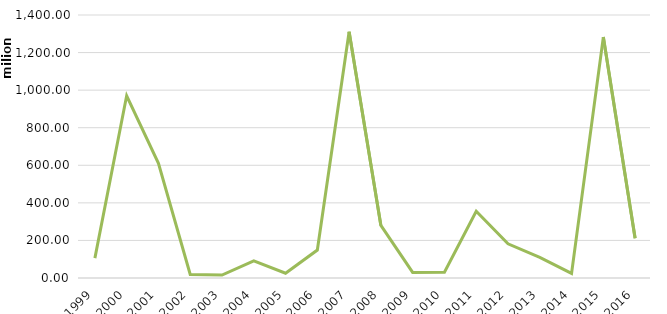
| Category | Total damage from fires in denars |
|---|---|
| 1999.0 | 105837151 |
| 2000.0 | 969852057 |
| 2001.0 | 610814677 |
| 2002.0 | 18531939 |
| 2003.0 | 15594691 |
| 2004.0 | 91083591 |
| 2005.0 | 25287638 |
| 2006.0 | 148712782 |
| 2007.0 | 1311167721.95 |
| 2008.0 | 280083235 |
| 2009.0 | 29746034 |
| 2010.0 | 31007401 |
| 2011.0 | 355053833.58 |
| 2012.0 | 181927608.62 |
| 2013.0 | 109500306 |
| 2014.0 | 24655527 |
| 2015.0 | 1282348110 |
| 2016.0 | 211363850 |